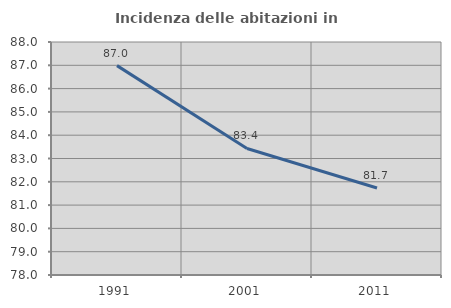
| Category | Incidenza delle abitazioni in proprietà  |
|---|---|
| 1991.0 | 86.986 |
| 2001.0 | 83.43 |
| 2011.0 | 81.734 |